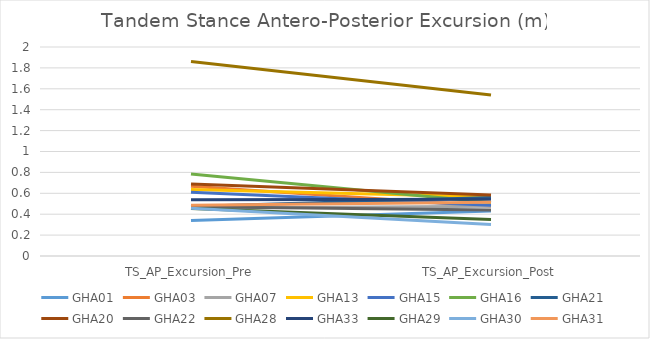
| Category | GHA01 | GHA03 | GHA07 | GHA13 | GHA15 | GHA16 | GHA21 | GHA20 | GHA22 | GHA28 | GHA33 | GHA29 | GHA30 | GHA31 |
|---|---|---|---|---|---|---|---|---|---|---|---|---|---|---|
| TS_AP_Excursion_Pre | 0.341 | 0.667 | 0.456 | 0.637 | 0.611 | 0.784 | 0.473 | 0.69 | 0.471 | 1.862 | 0.539 | 0.454 | 0.457 | 0.486 |
| TS_AP_Excursion_Post | 0.431 | 0.475 | 0.475 | 0.566 | 0.486 | 0.512 | 0.561 | 0.584 | 0.441 | 1.54 | 0.544 | 0.348 | 0.301 | 0.514 |